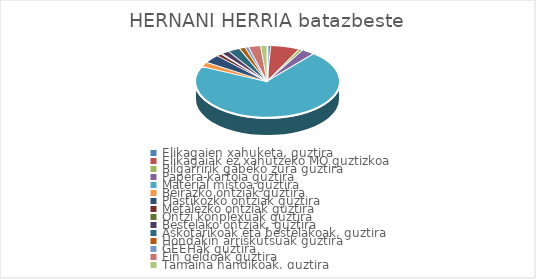
| Category | HERNANI HERRIA batazbeste |
|---|---|
| Elikagaien xahuketa, guztira | 0.008 |
| Elikagaiak ez xahutzeko MO guztizkoa | 0.066 |
| Bilgarririk gabeko zura guztira | 0.008 |
| Papera-kartoia guztira | 0.029 |
| Material mistoa guztira | 0.707 |
| Beirazko ontziak guztira | 0.021 |
| Plastikozko ontziak guztira | 0.037 |
| Metalezko ontziak guztira | 0.011 |
| Ontzi konplexuak guztira | 0.003 |
| Bestelako ontziak, guztira | 0.017 |
| Askotarikoak eta bestelakoak, guztira | 0.027 |
| Hondakin arriskutsuak guztira | 0.013 |
| GEEHak guztira | 0.008 |
| Fin geldoak guztira | 0.027 |
| Tamaina handikoak, guztira | 0.015 |